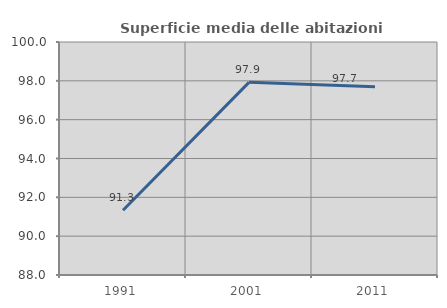
| Category | Superficie media delle abitazioni occupate |
|---|---|
| 1991.0 | 91.336 |
| 2001.0 | 97.922 |
| 2011.0 | 97.695 |